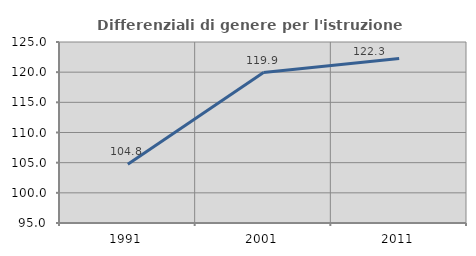
| Category | Differenziali di genere per l'istruzione superiore |
|---|---|
| 1991.0 | 104.751 |
| 2001.0 | 119.931 |
| 2011.0 | 122.278 |